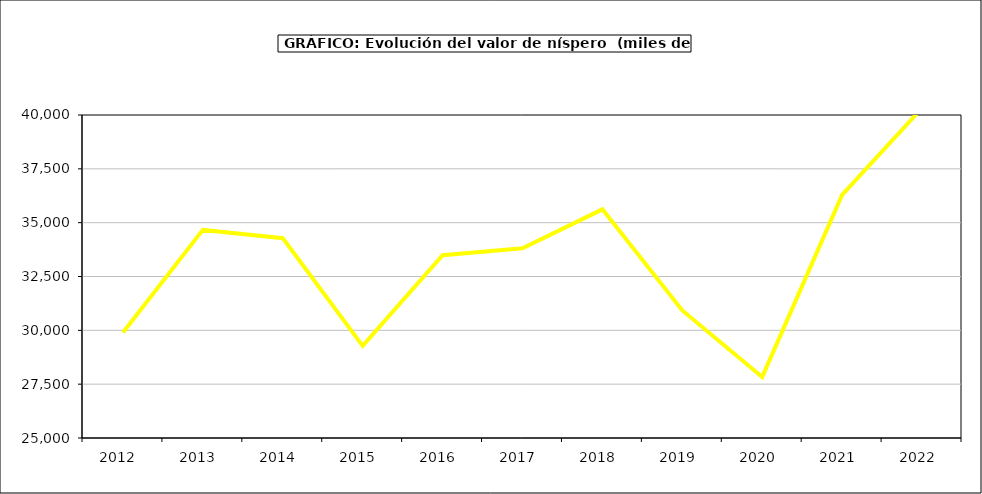
| Category | valor níspero |
|---|---|
| 2012.0 | 29897.05 |
| 2013.0 | 34664.445 |
| 2014.0 | 34281.045 |
| 2015.0 | 29278 |
| 2016.0 | 33490 |
| 2017.0 | 33807.127 |
| 2018.0 | 35617.316 |
| 2019.0 | 30923.726 |
| 2020.0 | 27836.442 |
| 2021.0 | 36288.539 |
| 2022.0 | 40325.795 |